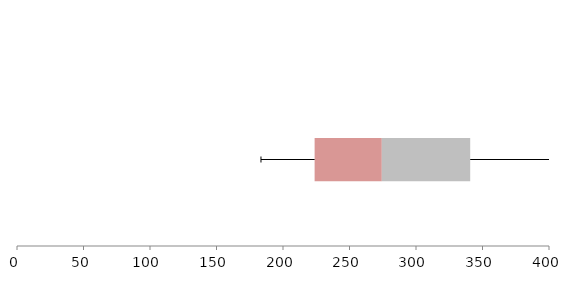
| Category | Series 1 | Series 2 | Series 3 |
|---|---|---|---|
| 0 | 223.771 | 50.525 | 66.45 |